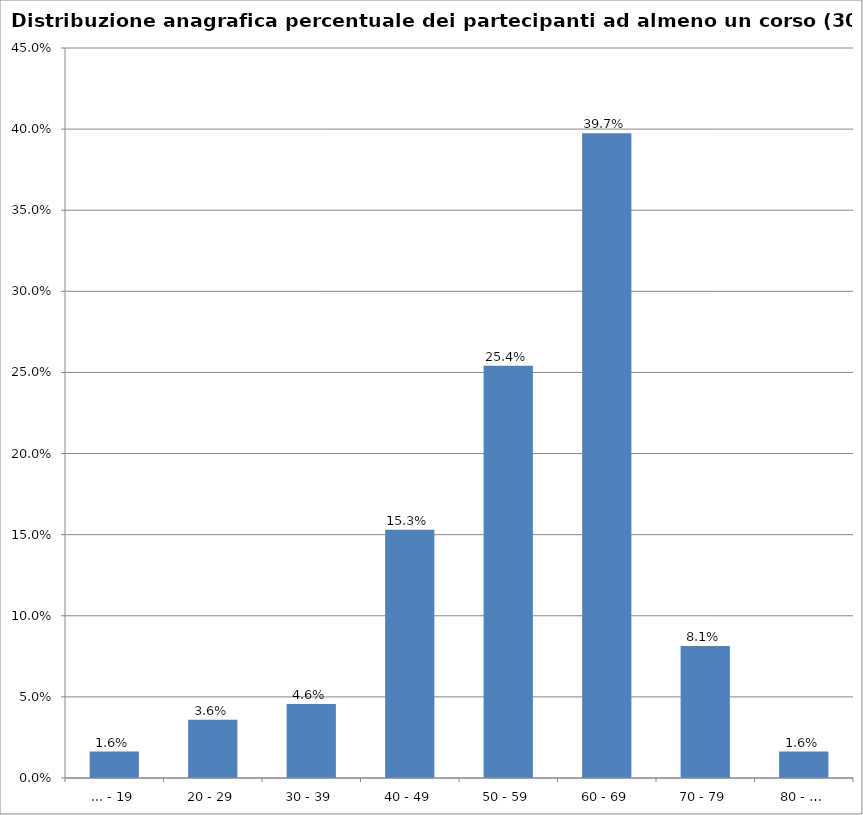
| Category | % Tesserati |
|---|---|
| ... - 19 | 0.016 |
| 20 - 29 | 0.036 |
| 30 - 39 | 0.046 |
| 40 - 49 | 0.153 |
| 50 - 59 | 0.254 |
| 60 - 69 | 0.397 |
| 70 - 79 | 0.081 |
| 80 - … | 0.016 |